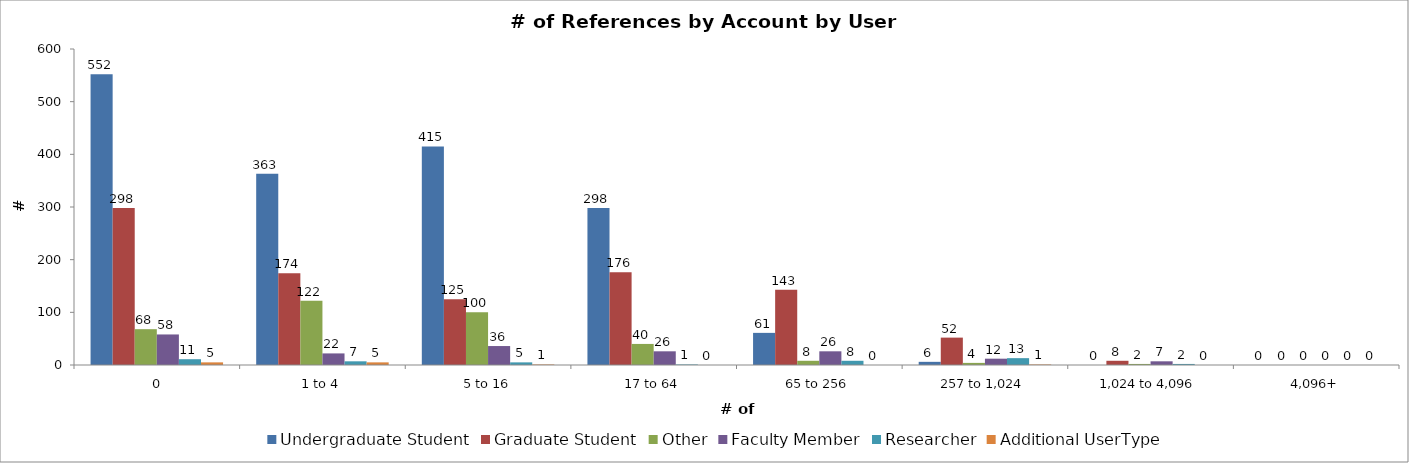
| Category | Undergraduate Student | Graduate Student | Other | Faculty Member | Researcher | Additional UserType |
|---|---|---|---|---|---|---|
|  0 | 552 | 298 | 68 | 58 | 11 | 5 |
| 1 to 4 | 363 | 174 | 122 | 22 | 7 | 5 |
| 5 to 16 | 415 | 125 | 100 | 36 | 5 | 1 |
| 17 to 64 | 298 | 176 | 40 | 26 | 1 | 0 |
| 65 to 256 | 61 | 143 | 8 | 26 | 8 | 0 |
| 257 to 1,024 | 6 | 52 | 4 | 12 | 13 | 1 |
| 1,024 to 4,096 | 0 | 8 | 2 | 7 | 2 | 0 |
| 4,096+ | 0 | 0 | 0 | 0 | 0 | 0 |